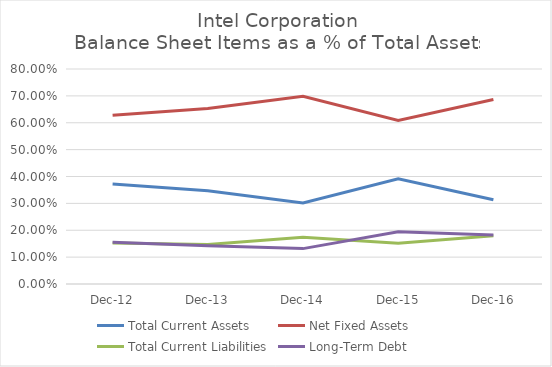
| Category | Total Current Assets | Net Fixed Assets | Total Current Liabilities | Long-Term Debt |
|---|---|---|---|---|
| 2016-12-31 | 0.313 | 0.687 | 0.179 | 0.182 |
| 2015-12-31 | 0.392 | 0.608 | 0.152 | 0.194 |
| 2014-12-31 | 0.302 | 0.698 | 0.174 | 0.132 |
| 2013-12-31 | 0.347 | 0.653 | 0.147 | 0.143 |
| 2012-12-31 | 0.372 | 0.628 | 0.153 | 0.156 |